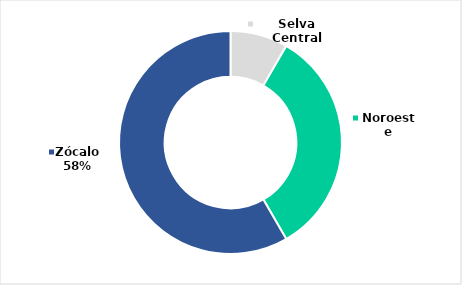
| Category | Series 0 |
|---|---|
| Selva Central | 1 |
| Noroeste | 4 |
| Zócalo | 7 |